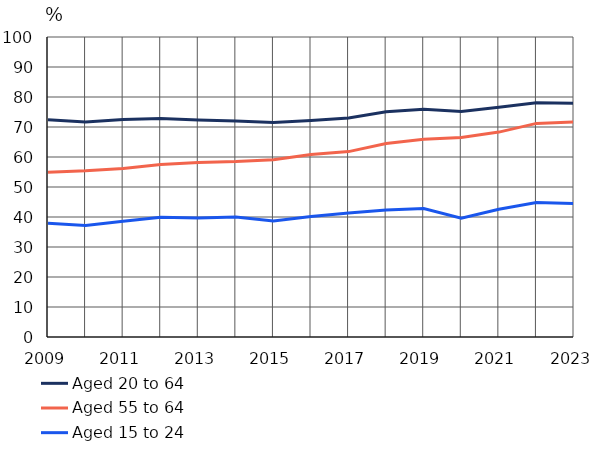
| Category | Aged 20 to 64 | Aged 55 to 64 | Aged 15 to 24 |
|---|---|---|---|
| 2009 | 72.4 | 54.9 | 37.9 |
| 2010 | 71.7 | 55.4 | 37.2 |
| 2011 | 72.5 | 56.2 | 38.6 |
| 2012 | 72.8 | 57.5 | 39.9 |
| 2013 | 72.3 | 58.2 | 39.7 |
| 2014 | 72 | 58.5 | 40 |
| 2015 | 71.5 | 59.1 | 38.7 |
| 2016 | 72.2 | 60.8 | 40.2 |
| 2017 | 73 | 61.8 | 41.3 |
| 2018 | 75.1 | 64.5 | 42.3 |
| 2019 | 75.9 | 65.9 | 42.8 |
| 2020 | 75.2 | 66.5 | 39.6 |
| 2021 | 76.6 | 68.3 | 42.6 |
| 2022 | 78.1 | 71.2 | 44.8 |
| 2023 | 77.9 | 71.7 | 44.5 |